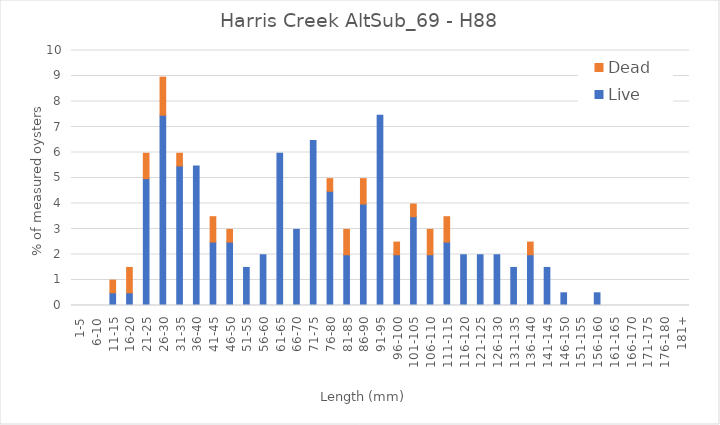
| Category | Live | Dead |
|---|---|---|
| 1-5 | 0 | 0 |
| 6-10 | 0 | 0 |
| 11-15 | 0.498 | 0.498 |
| 16-20 | 0.498 | 0.995 |
| 21-25 | 4.975 | 0.995 |
| 26-30 | 7.463 | 1.493 |
| 31-35 | 5.473 | 0.498 |
| 36-40 | 5.473 | 0 |
| 41-45 | 2.488 | 0.995 |
| 46-50 | 2.488 | 0.498 |
| 51-55 | 1.493 | 0 |
| 56-60 | 1.99 | 0 |
| 61-65 | 5.97 | 0 |
| 66-70 | 2.985 | 0 |
| 71-75 | 6.468 | 0 |
| 76-80 | 4.478 | 0.498 |
| 81-85 | 1.99 | 0.995 |
| 86-90 | 3.98 | 0.995 |
| 91-95 | 7.463 | 0 |
| 96-100 | 1.99 | 0.498 |
| 101-105 | 3.483 | 0.498 |
| 106-110 | 1.99 | 0.995 |
| 111-115 | 2.488 | 0.995 |
| 116-120 | 1.99 | 0 |
| 121-125 | 1.99 | 0 |
| 126-130 | 1.99 | 0 |
| 131-135 | 1.493 | 0 |
| 136-140 | 1.99 | 0.498 |
| 141-145 | 1.493 | 0 |
| 146-150 | 0.498 | 0 |
| 151-155 | 0 | 0 |
| 156-160 | 0.498 | 0 |
| 161-165 | 0 | 0 |
| 166-170 | 0 | 0 |
| 171-175 | 0 | 0 |
| 176-180 | 0 | 0 |
| 181+ | 0 | 0 |